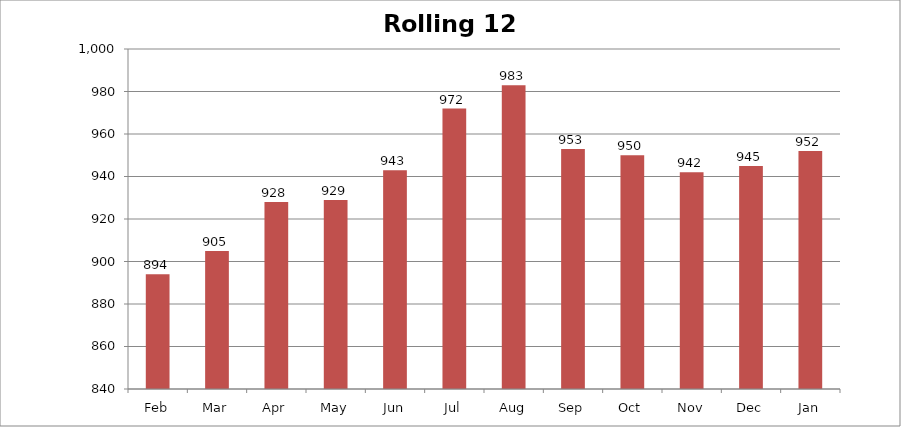
| Category | Rolling 12 Month |
|---|---|
| Feb | 894 |
| Mar | 905 |
| Apr | 928 |
| May | 929 |
| Jun | 943 |
| Jul | 972 |
| Aug | 983 |
| Sep | 953 |
| Oct | 950 |
| Nov | 942 |
| Dec | 945 |
| Jan | 952 |